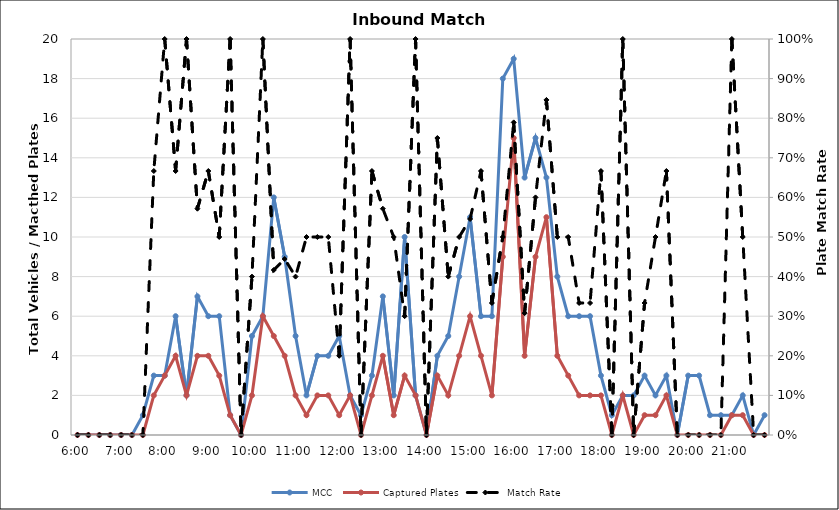
| Category | MCC | Captured Plates |
|---|---|---|
| 0.25 | 0 | 0 |
| 0.260416666666667 | 0 | 0 |
| 0.270833333333333 | 0 | 0 |
| 0.28125 | 0 | 0 |
| 0.291666666666667 | 0 | 0 |
| 0.302083333333333 | 0 | 0 |
| 0.3125 | 1 | 0 |
| 0.322916666666667 | 3 | 2 |
| 0.333333333333333 | 3 | 3 |
| 0.34375 | 6 | 4 |
| 0.354166666666667 | 2 | 2 |
| 0.364583333333333 | 7 | 4 |
| 0.375 | 6 | 4 |
| 0.385416666666667 | 6 | 3 |
| 0.395833333333333 | 1 | 1 |
| 0.40625 | 0 | 0 |
| 0.416666666666667 | 5 | 2 |
| 0.427083333333333 | 6 | 6 |
| 0.4375 | 12 | 5 |
| 0.447916666666667 | 9 | 4 |
| 0.458333333333333 | 5 | 2 |
| 0.46875 | 2 | 1 |
| 0.479166666666667 | 4 | 2 |
| 0.489583333333333 | 4 | 2 |
| 0.5 | 5 | 1 |
| 0.510416666666667 | 2 | 2 |
| 0.520833333333333 | 1 | 0 |
| 0.53125 | 3 | 2 |
| 0.541666666666667 | 7 | 4 |
| 0.552083333333333 | 2 | 1 |
| 0.5625 | 10 | 3 |
| 0.572916666666667 | 2 | 2 |
| 0.583333333333333 | 0 | 0 |
| 0.59375 | 4 | 3 |
| 0.604166666666667 | 5 | 2 |
| 0.614583333333333 | 8 | 4 |
| 0.625 | 11 | 6 |
| 0.635416666666667 | 6 | 4 |
| 0.645833333333333 | 6 | 2 |
| 0.65625 | 18 | 9 |
| 0.666666666666667 | 19 | 15 |
| 0.677083333333333 | 13 | 4 |
| 0.6875 | 15 | 9 |
| 0.697916666666667 | 13 | 11 |
| 0.708333333333333 | 8 | 4 |
| 0.71875 | 6 | 3 |
| 0.729166666666667 | 6 | 2 |
| 0.739583333333333 | 6 | 2 |
| 0.75 | 3 | 2 |
| 0.760416666666667 | 1 | 0 |
| 0.770833333333333 | 2 | 2 |
| 0.78125 | 2 | 0 |
| 0.791666666666667 | 3 | 1 |
| 0.802083333333333 | 2 | 1 |
| 0.8125 | 3 | 2 |
| 0.822916666666667 | 0 | 0 |
| 0.833333333333333 | 3 | 0 |
| 0.84375 | 3 | 0 |
| 0.854166666666667 | 1 | 0 |
| 0.864583333333333 | 1 | 0 |
| 0.875 | 1 | 1 |
| 0.885416666666667 | 2 | 1 |
| 0.895833333333333 | 0 | 0 |
| 0.90625 | 1 | 0 |